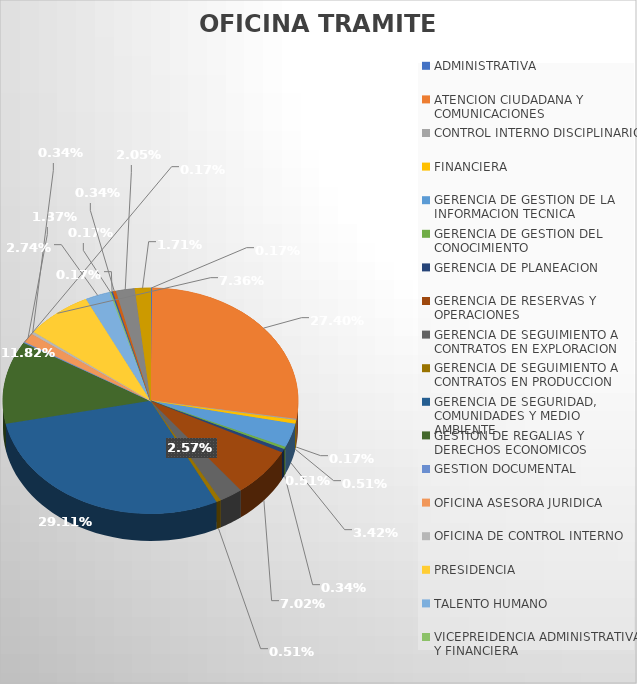
| Category | CANTIDAD |
|---|---|
| ADMINISTRATIVA | 1 |
| ATENCION CIUDADANA Y COMUNICACIONES | 160 |
| CONTROL INTERNO DISCIPLINARIO | 1 |
| FINANCIERA | 3 |
| GERENCIA DE GESTION DE LA INFORMACION TECNICA | 20 |
| GERENCIA DE GESTION DEL CONOCIMIENTO | 2 |
| GERENCIA DE PLANEACION | 3 |
| GERENCIA DE RESERVAS Y OPERACIONES | 41 |
| GERENCIA DE SEGUIMIENTO A CONTRATOS EN EXPLORACION | 15 |
| GERENCIA DE SEGUIMIENTO A CONTRATOS EN PRODUCCION | 3 |
| GERENCIA DE SEGURIDAD, COMUNIDADES Y MEDIO AMBIENTE | 170 |
| GESTION DE REGALIAS Y DERECHOS ECONOMICOS | 69 |
| GESTION DOCUMENTAL | 1 |
| OFICINA ASESORA JURIDICA | 8 |
| OFICINA DE CONTROL INTERNO | 2 |
| PRESIDENCIA | 43 |
| TALENTO HUMANO | 16 |
| VICEPREIDENCIA ADMINISTRATIVA Y FINANCIERA | 1 |
| VICEPRESIDENCIA ADMINISTRATIVA Y FINANCIERA | 1 |
| VICEPRESIDENCIA DE OPERACIONES, REGALIAS Y PARTICIPACIONES | 2 |
| VICEPRESIDENCIA PROMOCION Y ASIGNACION DE AREAS | 12 |
| VICEPRESIDENCIA TECNICA | 10 |